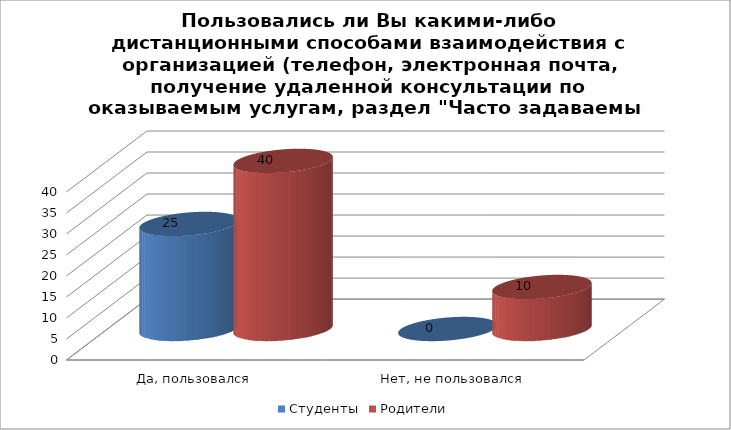
| Category | Студенты | Родители |
|---|---|---|
| Да, пользовался | 25 | 40 |
| Нет, не пользовался | 0 | 10 |